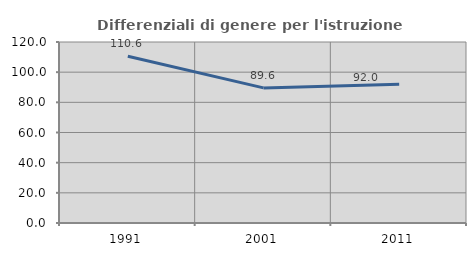
| Category | Differenziali di genere per l'istruzione superiore |
|---|---|
| 1991.0 | 110.578 |
| 2001.0 | 89.57 |
| 2011.0 | 92.047 |